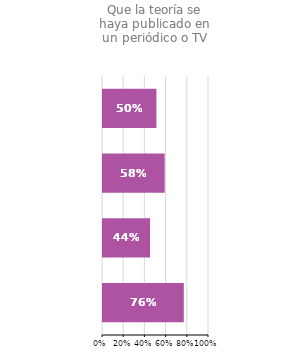
| Category | That the theory had been reported in a newspaper or on TV |
|---|---|
| Turkey | 0.762 |
| Israel | 0.444 |
| USA | 0.582 |
| Europe total | 0.504 |